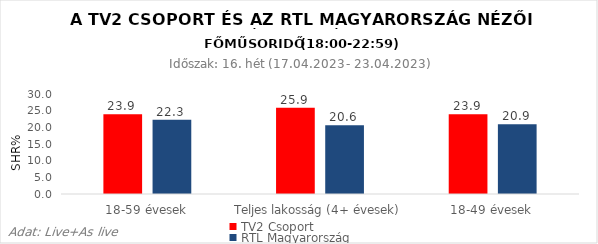
| Category | TV2 Csoport | RTL Magyarország |
|---|---|---|
| 18-59 évesek | 23.9 | 22.3 |
| Teljes lakosság (4+ évesek) | 25.9 | 20.6 |
| 18-49 évesek | 23.9 | 20.9 |